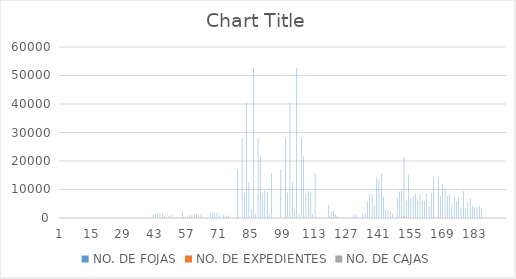
| Category | NO. DE FOJAS | NO. DE EXPEDIENTES | NO. DE CAJAS |
|---|---|---|---|
| 0 | 0 | 0 | 0 |
| 1 | 0 | 0 | 0 |
| 2 | 0 | 0 | 0 |
| 3 | 0 | 0 | 0 |
| 4 | 0 | 0 | 0 |
| 5 | 0 | 0 | 0 |
| 6 | 0 | 0 | 0 |
| 7 | 0 | 0 | 0 |
| 8 | 0 | 0 | 0 |
| 9 | 0 | 0 | 0 |
| 10 | 0 | 0 | 0 |
| 11 | 0 | 0 | 0 |
| 12 | 0 | 0 | 0 |
| 13 | 0 | 0 | 0 |
| 14 | 0 | 0 | 0 |
| 15 | 0 | 0 | 0 |
| 16 | 0 | 0 | 0 |
| 17 | 0 | 0 | 0 |
| 18 | 0 | 0 | 0 |
| 19 | 0 | 0 | 0 |
| 20 | 0 | 0 | 0 |
| 21 | 0 | 0 | 0 |
| 22 | 0 | 0 | 0 |
| 23 | 0 | 0 | 0 |
| 24 | 0 | 0 | 0 |
| 25 | 0 | 0 | 0 |
| 26 | 0 | 0 | 0 |
| 27 | 0 | 0 | 0 |
| 28 | 0 | 0 | 0 |
| 29 | 0 | 0 | 0 |
| 30 | 0 | 0 | 0 |
| 31 | 0 | 0 | 0 |
| 32 | 0 | 0 | 0 |
| 33 | 0 | 0 | 0 |
| 34 | 0 | 0 | 0 |
| 35 | 0 | 0 | 0 |
| 36 | 0 | 0 | 0 |
| 37 | 0 | 0 | 0 |
| 38 | 0 | 0 | 0 |
| 39 | 0 | 0 | 0 |
| 40 | 0 | 0 | 0 |
| 41 | 1168 | 31 | 2 |
| 42 | 1212 | 28 | 2 |
| 43 | 1883 | 40 | 3 |
| 44 | 1767 | 43 | 3 |
| 45 | 1548 | 69 | 3 |
| 46 | 592 | 52 | 2 |
| 47 | 402 | 46 | 2 |
| 48 | 813 | 57 | 2 |
| 49 | 1089 | 14 | 1 |
| 50 | 0 | 0 | 2 |
| 51 | 0 | 0 | 2 |
| 52 | 0 | 45 | 1 |
| 53 | 0 | 60 | 1 |
| 54 | 2500 | 190 | 3 |
| 55 | 550 | 21 | 3 |
| 56 | 420 | 45 | 4 |
| 57 | 993 | 52 | 2 |
| 58 | 1052 | 43 | 2 |
| 59 | 1240 | 85 | 3 |
| 60 | 1661 | 68 | 3 |
| 61 | 1274 | 57 | 3 |
| 62 | 1408 | 97 | 3 |
| 63 | 0 | 30 | 0 |
| 64 | 0 | 7 | 0 |
| 65 | 0 | 0 | 0 |
| 66 | 1735 | 43 | 3 |
| 67 | 2010 | 37 | 3 |
| 68 | 1653 | 49 | 3 |
| 69 | 1670 | 55 | 3 |
| 70 | 993 | 52 | 2 |
| 71 | 0 | 0 | 0 |
| 72 | 1152 | 43 | 2 |
| 73 | 853 | 55 | 2 |
| 74 | 752 | 60 | 2 |
| 75 | 0 | 0 | 0 |
| 76 | 0 | 0 | 0 |
| 77 | 0 | 0 | 0 |
| 78 | 17125 | 66 | 6 |
| 79 | 0 | 0 | 0 |
| 80 | 28199 | 169 | 15 |
| 81 | 8887 | 210 | 4 |
| 82 | 40528 | 294 | 13 |
| 83 | 12567 | 164 | 8 |
| 84 | 2923 | 23 | 2 |
| 85 | 52696 | 122 | 7 |
| 86 | 1436 | 9 | 2 |
| 87 | 28143 | 57 | 3 |
| 88 | 21550 | 62 | 4 |
| 89 | 8566 | 52 | 5 |
| 90 | 9636 | 70 | 5 |
| 91 | 9000 | 298 | 3 |
| 92 | 1444 | 9 | 1 |
| 93 | 15676 | 103 | 4 |
| 94 | 0 | 0 | 0 |
| 95 | 0 | 0 | 0 |
| 96 | 0 | 0 | 0 |
| 97 | 17125 | 66 | 6 |
| 98 | 0 | 0 | 0 |
| 99 | 28199 | 169 | 15 |
| 100 | 8887 | 210 | 4 |
| 101 | 40528 | 294 | 13 |
| 102 | 12567 | 164 | 8 |
| 103 | 2923 | 23 | 2 |
| 104 | 52696 | 122 | 7 |
| 105 | 1436 | 9 | 2 |
| 106 | 28143 | 57 | 3 |
| 107 | 21550 | 62 | 4 |
| 108 | 8566 | 52 | 5 |
| 109 | 9636 | 70 | 5 |
| 110 | 9000 | 298 | 3 |
| 111 | 1444 | 9 | 1 |
| 112 | 15676 | 103 | 4 |
| 113 | 0 | 0 | 0 |
| 114 | 0 | 0 | 0 |
| 115 | 0 | 0 | 0 |
| 116 | 0 | 0 | 0 |
| 117 | 0 | 0 | 0 |
| 118 | 4656 | 604 | 17 |
| 119 | 2472 | 257 | 15 |
| 120 | 2494 | 374 | 10 |
| 121 | 1012 | 578 | 3 |
| 122 | 222 | 5 | 2 |
| 123 | 205 | 10 | 2 |
| 124 | 17 | 1 | 1 |
| 125 | 0 | 0 | 0 |
| 126 | 111 | 3 | 1 |
| 127 | 213 | 12 | 2 |
| 128 | 244 | 11 | 1 |
| 129 | 1246 | 38 | 2 |
| 130 | 1337 | 45 | 2 |
| 131 | 22 | 1 | 1 |
| 132 | 0 | 0 | 0 |
| 133 | 1879 | 65 | 1 |
| 134 | 1266 | 7 | 1 |
| 135 | 5958 | 48 | 1 |
| 136 | 8346 | 58 | 1 |
| 137 | 8419 | 36 | 1 |
| 138 | 4421 | 53 | 1 |
| 139 | 14213 | 78 | 2 |
| 140 | 13634 | 71 | 3 |
| 141 | 15554 | 207 | 3 |
| 142 | 7420 | 41 | 1 |
| 143 | 2815 | 36 | 1 |
| 144 | 2814 | 37 | 1 |
| 145 | 2495 | 45 | 1 |
| 146 | 1579 | 27 | 1 |
| 147 | 0 | 0 | 0 |
| 148 | 6812 | 95 | 2 |
| 149 | 9318 | 172 | 2 |
| 150 | 9568 | 154 | 4 |
| 151 | 21391 | 522 | 10 |
| 152 | 6053 | 388 | 4 |
| 153 | 15130 | 259 | 5 |
| 154 | 6953 | 131 | 3 |
| 155 | 7901 | 90 | 4 |
| 156 | 8510 | 93 | 3 |
| 157 | 6622 | 73 | 3 |
| 158 | 8203 | 91 | 4 |
| 159 | 5999 | 371 | 2 |
| 160 | 5999 | 187 | 2 |
| 161 | 8345 | 151 | 4 |
| 162 | 4230 | 86 | 3 |
| 163 | 8808 | 93 | 3 |
| 164 | 14862 | 219 | 4 |
| 165 | 0 | 0 | 0 |
| 166 | 14165 | 308 | 4 |
| 167 | 7655 | 162 | 4 |
| 168 | 11953 | 141 | 4 |
| 169 | 10465 | 149 | 3 |
| 170 | 7744 | 174 | 3 |
| 171 | 8194 | 223 | 3 |
| 172 | 4700 | 342 | 2 |
| 173 | 7913 | 89 | 3 |
| 174 | 5814 | 151 | 2 |
| 175 | 7451 | 164 | 2 |
| 176 | 3594 | 79 | 2 |
| 177 | 9412 | 77 | 3 |
| 178 | 3138 | 319 | 2 |
| 179 | 5646 | 60 | 2 |
| 180 | 6845 | 60 | 2 |
| 181 | 4050 | 73 | 1 |
| 182 | 3806 | 102 | 1 |
| 183 | 3655 | 136 | 1 |
| 184 | 4291 | 182 | 1 |
| 185 | 3342 | 83 | 1 |
| 186 | 0 | 0 | 0 |
| 187 | 0 | 0 | 0 |
| 188 | 0 | 0 | 0 |
| 189 | 0 | 0 | 0 |
| 190 | 0 | 0 | 0 |
| 191 | 0 | 0 | 0 |
| 192 | 0 | 0 | 0 |
| 193 | 0 | 0 | 0 |
| 194 | 0 | 0 | 0 |
| 195 | 0 | 0 | 0 |